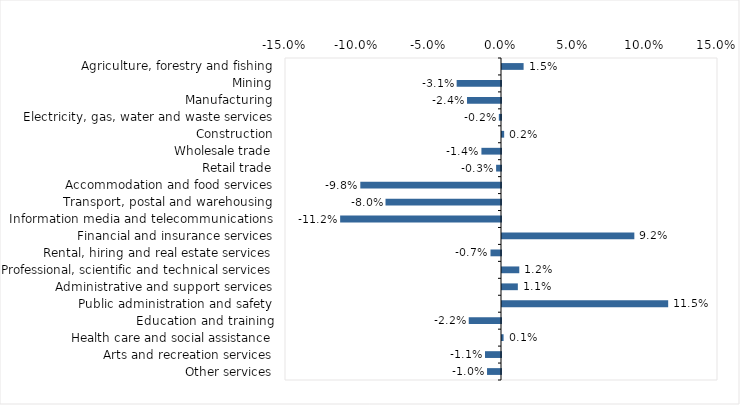
| Category | This week |
|---|---|
| Agriculture, forestry and fishing | 0.015 |
| Mining | -0.031 |
| Manufacturing | -0.024 |
| Electricity, gas, water and waste services | -0.002 |
| Construction | 0.002 |
| Wholesale trade | -0.014 |
| Retail trade | -0.003 |
| Accommodation and food services | -0.098 |
| Transport, postal and warehousing | -0.08 |
| Information media and telecommunications | -0.112 |
| Financial and insurance services | 0.092 |
| Rental, hiring and real estate services | -0.007 |
| Professional, scientific and technical services | 0.012 |
| Administrative and support services | 0.011 |
| Public administration and safety | 0.115 |
| Education and training | -0.022 |
| Health care and social assistance | 0.001 |
| Arts and recreation services | -0.011 |
| Other services | -0.01 |